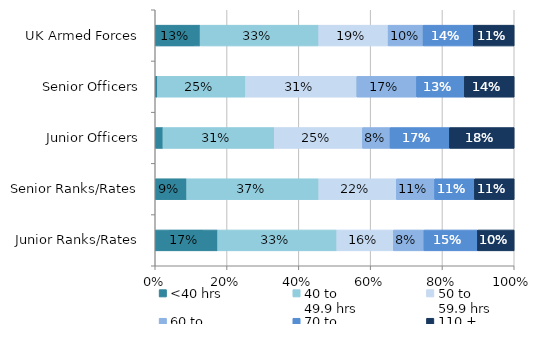
| Category | <40 hrs | 40 to 
49.9 hrs | 50 to 
59.9 hrs | 60 to 
69.9 hrs | 70 to 
109.9 hrs | 110 + 
hrs |
|---|---|---|---|---|---|---|
| UK Armed Forces | 0.125 | 0.33 | 0.193 | 0.097 | 0.14 | 0.114 |
| Senior Officers | 0.006 | 0.245 | 0.31 | 0.166 | 0.133 | 0.139 |
| Junior Officers | 0.022 | 0.31 | 0.245 | 0.077 | 0.166 | 0.18 |
| Senior Ranks/Rates | 0.088 | 0.368 | 0.216 | 0.107 | 0.111 | 0.111 |
| Junior Ranks/Rates | 0.174 | 0.332 | 0.158 | 0.085 | 0.149 | 0.103 |